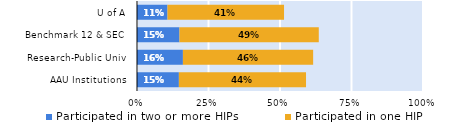
| Category | Participated in two or more HIPs | Participated in one HIP |
|---|---|---|
| AAU Institutions | 0.146 | 0.445 |
| Research-Public Univ | 0.161 | 0.455 |
| Benchmark 12 & SEC | 0.149 | 0.487 |
| U of A | 0.107 | 0.408 |